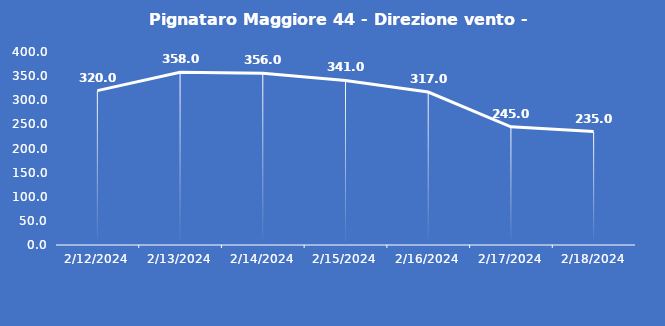
| Category | Pignataro Maggiore 44 - Direzione vento - Grezzo (°N) |
|---|---|
| 2/12/24 | 320 |
| 2/13/24 | 358 |
| 2/14/24 | 356 |
| 2/15/24 | 341 |
| 2/16/24 | 317 |
| 2/17/24 | 245 |
| 2/18/24 | 235 |